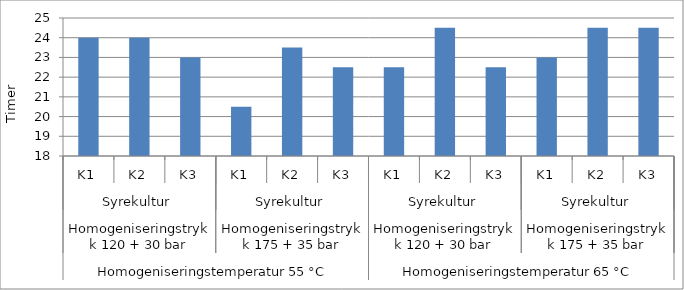
| Category | Syrningstid i timer |
|---|---|
| 0 | 24 |
| 1 | 24 |
| 2 | 23 |
| 3 | 20.5 |
| 4 | 23.5 |
| 5 | 22.5 |
| 6 | 22.5 |
| 7 | 24.5 |
| 8 | 22.5 |
| 9 | 23 |
| 10 | 24.5 |
| 11 | 24.5 |